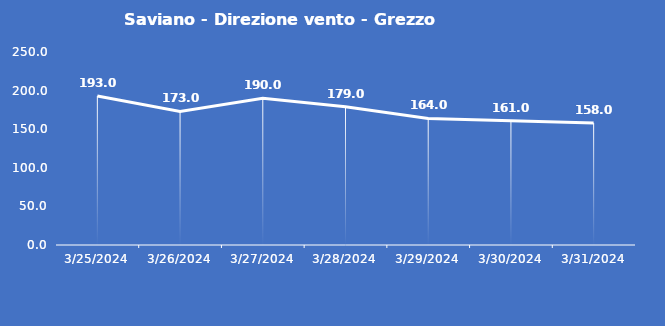
| Category | Saviano - Direzione vento - Grezzo (°N) |
|---|---|
| 3/25/24 | 193 |
| 3/26/24 | 173 |
| 3/27/24 | 190 |
| 3/28/24 | 179 |
| 3/29/24 | 164 |
| 3/30/24 | 161 |
| 3/31/24 | 158 |